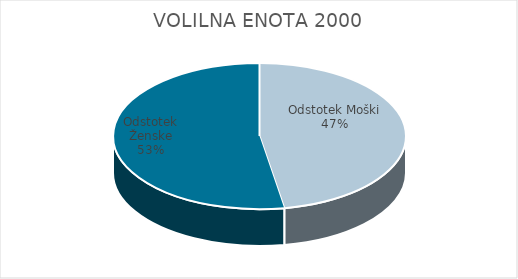
| Category | VOLILNA ENOTA 2000 | #REF! | Slovenija skupaj |
|---|---|---|---|
| Odstotek Moški | 23.22 |  | 24.13 |
| Odstotek Ženske | 25.87 |  | 27.06 |